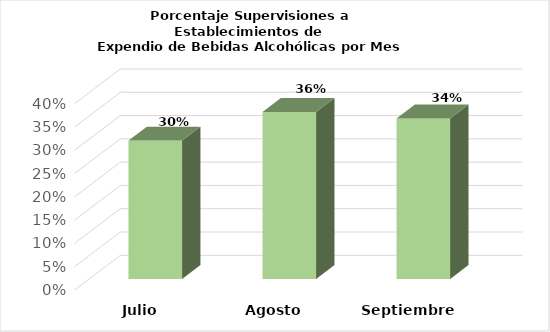
| Category | Series 0 |
|---|---|
| Julio | 0.297 |
| Agosto | 0.358 |
| Septiembre | 0.345 |